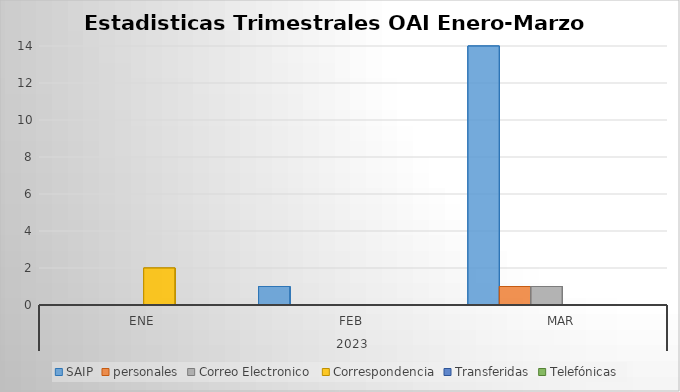
| Category | SAIP | personales | Correo Electronico  | Correspondencia | Transferidas | Telefónicas |
|---|---|---|---|---|---|---|
| 0 | 0 | 0 | 0 | 2 | 0 | 0 |
| 1 | 1 | 0 | 0 | 0 | 0 | 0 |
| 2 | 14 | 1 | 1 | 0 | 0 | 0 |